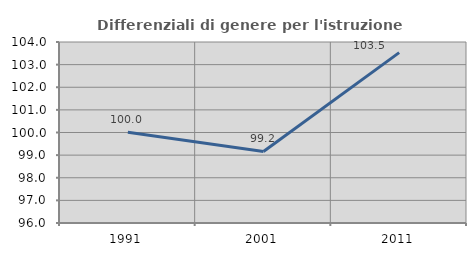
| Category | Differenziali di genere per l'istruzione superiore |
|---|---|
| 1991.0 | 100.014 |
| 2001.0 | 99.163 |
| 2011.0 | 103.532 |